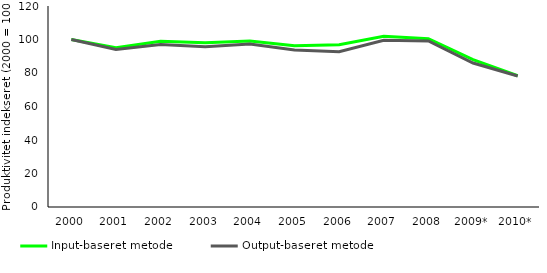
| Category | Input-baseret metode | Output-baseret metode |
|---|---|---|
| 2000 | 100 | 100 |
| 2001 | 95.035 | 94.027 |
| 2002 | 98.929 | 96.997 |
| 2003 | 98.039 | 95.682 |
| 2004 | 99.124 | 97.378 |
| 2005 | 96.308 | 93.772 |
| 2006 | 96.823 | 92.731 |
| 2007 | 101.874 | 99.555 |
| 2008 | 100.484 | 99.103 |
| 2009* | 87.969 | 85.955 |
| 2010* | 78.346 | 78.201 |